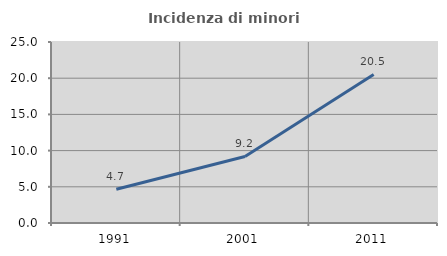
| Category | Incidenza di minori stranieri |
|---|---|
| 1991.0 | 4.651 |
| 2001.0 | 9.195 |
| 2011.0 | 20.522 |